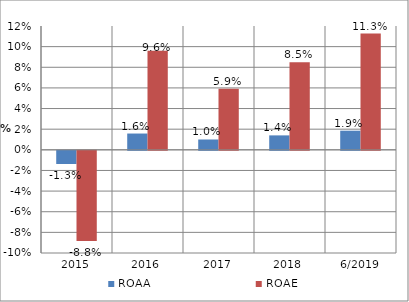
| Category | ROAA | ROAE |
|---|---|---|
| 2015 | -0.013 | -0.088 |
| 2016 | 0.016 | 0.096 |
| 2017 | 0.01 | 0.059 |
| 2018 | 0.014 | 0.085 |
| 6/2019 | 0.019 | 0.113 |